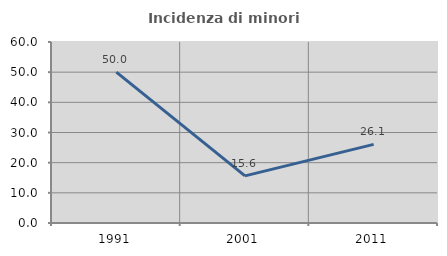
| Category | Incidenza di minori stranieri |
|---|---|
| 1991.0 | 50 |
| 2001.0 | 15.625 |
| 2011.0 | 26.05 |